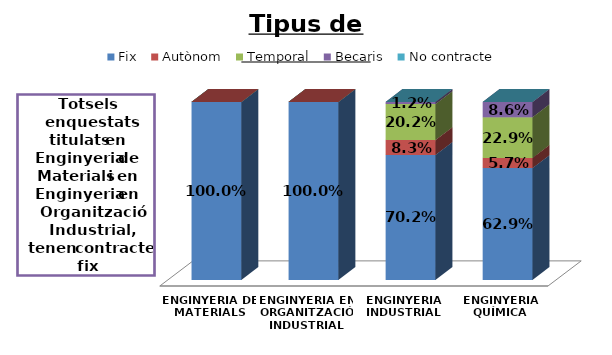
| Category | Fix | Autònom | Temporal | Becaris | No contracte |
|---|---|---|---|---|---|
| ENGINYERIA DE MATERIALS | 1 | 0 | 0 | 0 | 0 |
| ENGINYERIA EN ORGANITZACIÓ INDUSTRIAL | 1 | 0 | 0 | 0 | 0 |
| ENGINYERIA INDUSTRIAL | 0.702 | 0.083 | 0.202 | 0.012 | 0 |
| ENGINYERIA QUÍMICA | 0.629 | 0.057 | 0.229 | 0.086 | 0 |